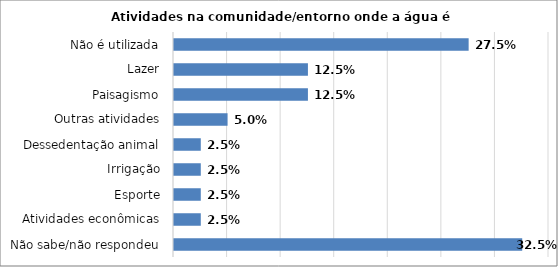
| Category | Series 0 |
|---|---|
| Não sabe/não respondeu | 0.325 |
| Atividades econômicas | 0.025 |
| Esporte | 0.025 |
| Irrigação | 0.025 |
| Dessedentação animal | 0.025 |
| Outras atividades | 0.05 |
| Paisagismo | 0.125 |
| Lazer | 0.125 |
| Não é utilizada | 0.275 |